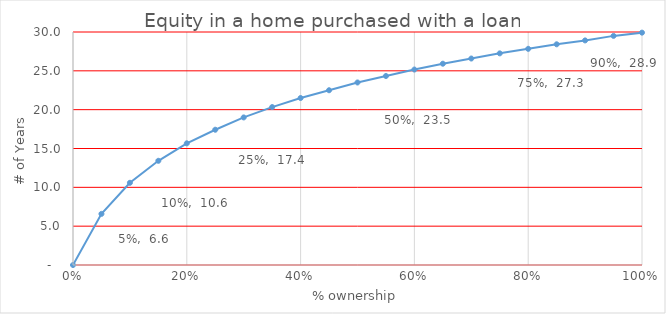
| Category | Years |
|---|---|
| 0.0 | 0 |
| 0.05 | 6.583 |
| 0.1 | 10.583 |
| 0.15 | 13.417 |
| 0.2 | 15.667 |
| 0.25 | 17.417 |
| 0.3 | 19 |
| 0.35 | 20.333 |
| 0.4 | 21.5 |
| 0.45 | 22.5 |
| 0.5 | 23.5 |
| 0.55 | 24.333 |
| 0.6 | 25.167 |
| 0.65 | 25.917 |
| 0.7 | 26.583 |
| 0.75 | 27.25 |
| 0.8 | 27.833 |
| 0.85 | 28.417 |
| 0.9 | 28.917 |
| 0.95 | 29.5 |
| 1.0 | 29.917 |